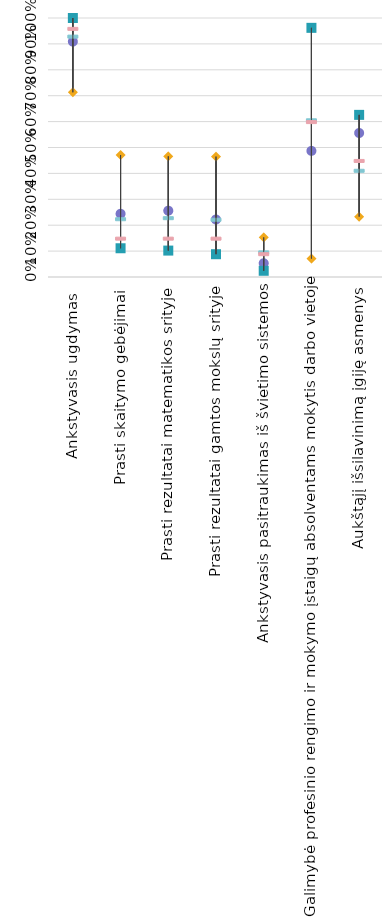
| Category | Lithuania | Strongest performer | Weakest performer | EU average | EU target |
|---|---|---|---|---|---|
| Ankstyvasis ugdymas  | 0.909 | 1 | 0.713 | 0.93 | 0.96 |
| Prasti skaitymo gebėjimai | 0.244 | 0.111 | 0.471 | 0.225 | 0.15 |
| Prasti rezultatai matematikos srityje | 0.256 | 0.102 | 0.466 | 0.229 | 0.15 |
| Prasti rezultatai gamtos mokslų srityje | 0.222 | 0.088 | 0.465 | 0.223 | 0.15 |
| Ankstyvasis pasitraukimas iš švietimo sistemos | 0.053 | 0.024 | 0.153 | 0.097 | 0.09 |
| Galimybė profesinio rengimo ir mokymo įstaigų absolventams mokytis darbo vietoje | 0.487 | 0.962 | 0.071 | 0.607 | 0.6 |
| Aukštąjį išsilavinimą įgiję asmenys | 0.556 | 0.626 | 0.233 | 0.412 | 0.45 |